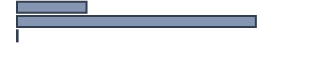
| Category | Series 0 |
|---|---|
| 0 | 22.5 |
| 1 | 77.3 |
| 2 | 0.2 |